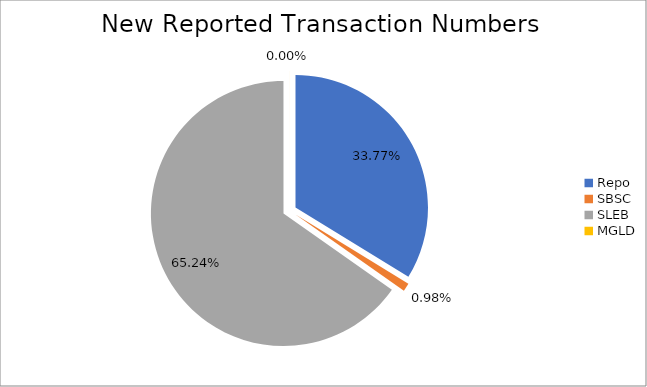
| Category | Series 0 |
|---|---|
| Repo | 309151 |
| SBSC | 8988 |
| SLEB | 597300 |
| MGLD | 38 |